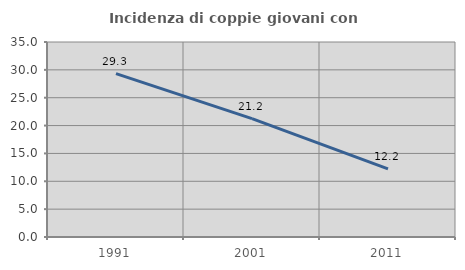
| Category | Incidenza di coppie giovani con figli |
|---|---|
| 1991.0 | 29.322 |
| 2001.0 | 21.234 |
| 2011.0 | 12.217 |